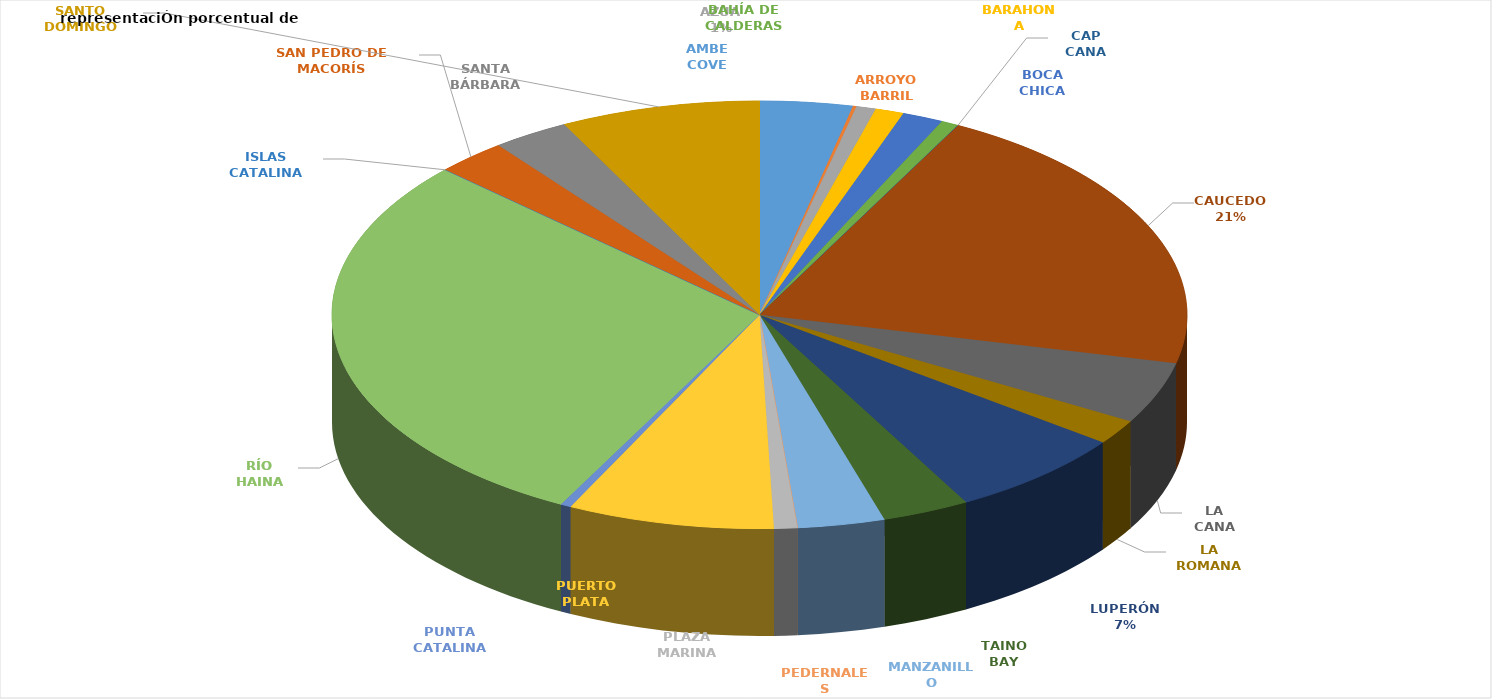
| Category | PORCENTUAL  |
|---|---|
| AMBE COVE | 0.035 |
| ARROYO BARRIL | 0.001 |
| AZUA | 0.007 |
| BARAHONA | 0.011 |
| BOCA CHICA | 0.015 |
| BAHÍA DE CALDERAS | 0.007 |
| CAP CANA | 0 |
| CAUCEDO | 0.21 |
| LA CANA | 0.046 |
| LA ROMANA | 0.019 |
| LUPERÓN  | 0.068 |
| TAINO BAY | 0.033 |
| MANZANILLO | 0.033 |
| PEDERNALES | 0 |
| PLAZA MARINA | 0.009 |
| PUERTO PLATA | 0.078 |
| PUNTA CATALINA | 0.004 |
| RÍO HAINA | 0.292 |
| ISLAS CATALINA | 0 |
| SAN PEDRO DE MACORÍS | 0.027 |
| SANTA BÁRBARA | 0.029 |
| SANTO DOMINGO | 0.075 |